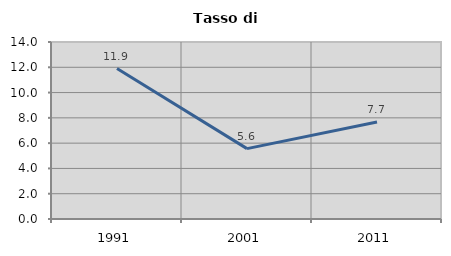
| Category | Tasso di disoccupazione   |
|---|---|
| 1991.0 | 11.902 |
| 2001.0 | 5.565 |
| 2011.0 | 7.676 |